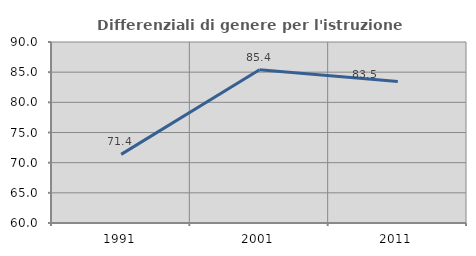
| Category | Differenziali di genere per l'istruzione superiore |
|---|---|
| 1991.0 | 71.37 |
| 2001.0 | 85.398 |
| 2011.0 | 83.453 |